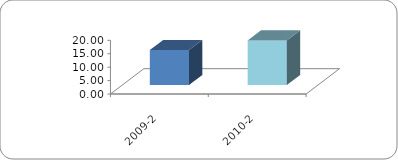
| Category | ALUMNO BECADO |
|---|---|
| 2009-2 | 13.05 |
| 2010-2 | 16.65 |